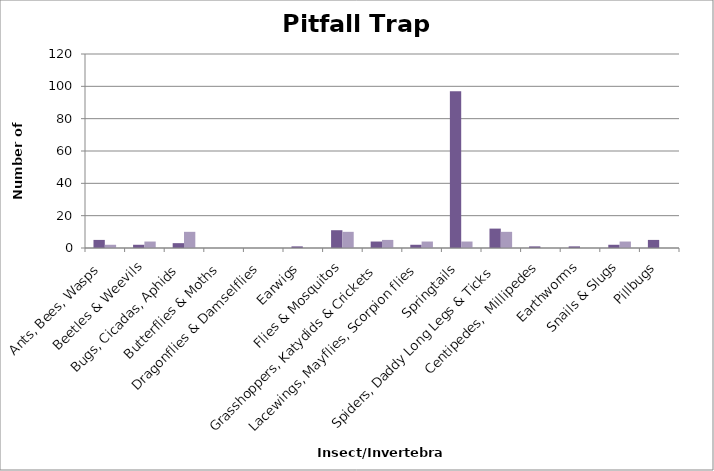
| Category | Pitfall Trap Sum      (Row 3) | Pitfall Trap Sum (Row 5) |
|---|---|---|
| Ants, Bees, Wasps | 5 | 2 |
| Beetles & Weevils | 2 | 4 |
| Bugs, Cicadas, Aphids | 3 | 10 |
| Butterflies & Moths | 0 | 0 |
| Dragonflies & Damselflies | 0 | 0 |
| Earwigs | 1 | 0 |
| Flies & Mosquitos | 11 | 10 |
| Grasshoppers, Katydids & Crickets | 4 | 5 |
| Lacewings, Mayflies, Scorpion flies | 2 | 4 |
| Springtails | 97 | 4 |
| Spiders, Daddy Long Legs & Ticks | 12 | 10 |
| Centipedes,  Millipedes | 1 | 0 |
| Earthworms | 1 | 0 |
| Snails & Slugs | 2 | 4 |
| Pillbugs | 5 | 0 |